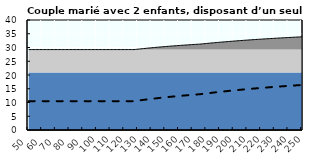
| Category | Coin fiscal moyen (somme des composantes) | Taux moyen d'imposition net en % du salaire brut |
|---|---|---|
| 50.0 | 29.249 | 10.5 |
| 51.0 | 29.249 | 10.5 |
| 52.0 | 29.249 | 10.5 |
| 53.0 | 29.249 | 10.5 |
| 54.0 | 29.249 | 10.5 |
| 55.0 | 29.249 | 10.5 |
| 56.0 | 29.249 | 10.5 |
| 57.0 | 29.249 | 10.5 |
| 58.0 | 29.249 | 10.5 |
| 59.0 | 29.249 | 10.5 |
| 60.0 | 29.249 | 10.5 |
| 61.0 | 29.249 | 10.5 |
| 62.0 | 29.249 | 10.5 |
| 63.0 | 29.249 | 10.5 |
| 64.0 | 29.249 | 10.5 |
| 65.0 | 29.249 | 10.5 |
| 66.0 | 29.249 | 10.5 |
| 67.0 | 29.249 | 10.5 |
| 68.0 | 29.249 | 10.5 |
| 69.0 | 29.249 | 10.5 |
| 70.0 | 29.249 | 10.5 |
| 71.0 | 29.249 | 10.5 |
| 72.0 | 29.249 | 10.5 |
| 73.0 | 29.249 | 10.5 |
| 74.0 | 29.249 | 10.5 |
| 75.0 | 29.249 | 10.5 |
| 76.0 | 29.249 | 10.5 |
| 77.0 | 29.249 | 10.5 |
| 78.0 | 29.249 | 10.5 |
| 79.0 | 29.249 | 10.5 |
| 80.0 | 29.249 | 10.5 |
| 81.0 | 29.249 | 10.5 |
| 82.0 | 29.249 | 10.5 |
| 83.0 | 29.249 | 10.5 |
| 84.0 | 29.249 | 10.5 |
| 85.0 | 29.249 | 10.5 |
| 86.0 | 29.249 | 10.5 |
| 87.0 | 29.249 | 10.5 |
| 88.0 | 29.249 | 10.5 |
| 89.0 | 29.249 | 10.5 |
| 90.0 | 29.249 | 10.5 |
| 91.0 | 29.249 | 10.5 |
| 92.0 | 29.249 | 10.5 |
| 93.0 | 29.249 | 10.5 |
| 94.0 | 29.249 | 10.5 |
| 95.0 | 29.249 | 10.5 |
| 96.0 | 29.249 | 10.5 |
| 97.0 | 29.249 | 10.5 |
| 98.0 | 29.249 | 10.5 |
| 99.0 | 29.249 | 10.5 |
| 100.0 | 29.249 | 10.5 |
| 101.0 | 29.249 | 10.5 |
| 102.0 | 29.249 | 10.5 |
| 103.0 | 29.249 | 10.5 |
| 104.0 | 29.249 | 10.5 |
| 105.0 | 29.249 | 10.5 |
| 106.0 | 29.249 | 10.5 |
| 107.0 | 29.249 | 10.5 |
| 108.0 | 29.249 | 10.5 |
| 109.0 | 29.249 | 10.5 |
| 110.0 | 29.249 | 10.5 |
| 111.0 | 29.249 | 10.5 |
| 112.0 | 29.249 | 10.5 |
| 113.0 | 29.249 | 10.5 |
| 114.0 | 29.249 | 10.5 |
| 115.0 | 29.249 | 10.5 |
| 116.0 | 29.249 | 10.5 |
| 117.0 | 29.249 | 10.5 |
| 118.0 | 29.249 | 10.5 |
| 119.0 | 29.249 | 10.5 |
| 120.0 | 29.249 | 10.5 |
| 121.0 | 29.249 | 10.5 |
| 122.0 | 29.249 | 10.5 |
| 123.0 | 29.249 | 10.5 |
| 124.0 | 29.249 | 10.5 |
| 125.0 | 29.249 | 10.5 |
| 126.0 | 29.249 | 10.5 |
| 127.0 | 29.249 | 10.5 |
| 128.0 | 29.29 | 10.551 |
| 129.0 | 29.346 | 10.622 |
| 130.0 | 29.401 | 10.692 |
| 131.0 | 29.455 | 10.76 |
| 132.0 | 29.508 | 10.828 |
| 133.0 | 29.561 | 10.894 |
| 134.0 | 29.613 | 10.96 |
| 135.0 | 29.664 | 11.025 |
| 136.0 | 29.714 | 11.088 |
| 137.0 | 29.764 | 11.151 |
| 138.0 | 29.812 | 11.213 |
| 139.0 | 29.861 | 11.274 |
| 140.0 | 29.908 | 11.334 |
| 141.0 | 29.955 | 11.393 |
| 142.0 | 30.001 | 11.451 |
| 143.0 | 30.046 | 11.509 |
| 144.0 | 30.091 | 11.565 |
| 145.0 | 30.135 | 11.621 |
| 146.0 | 30.179 | 11.677 |
| 147.0 | 30.222 | 11.731 |
| 148.0 | 30.265 | 11.785 |
| 149.0 | 30.306 | 11.838 |
| 150.0 | 30.348 | 11.89 |
| 151.0 | 30.389 | 11.942 |
| 152.0 | 30.429 | 11.992 |
| 153.0 | 30.469 | 12.043 |
| 154.0 | 30.508 | 12.092 |
| 155.0 | 30.546 | 12.141 |
| 156.0 | 30.585 | 12.19 |
| 157.0 | 30.622 | 12.237 |
| 158.0 | 30.66 | 12.284 |
| 159.0 | 30.696 | 12.331 |
| 160.0 | 30.733 | 12.377 |
| 161.0 | 30.768 | 12.422 |
| 162.0 | 30.804 | 12.467 |
| 163.0 | 30.839 | 12.511 |
| 164.0 | 30.873 | 12.555 |
| 165.0 | 30.907 | 12.598 |
| 166.0 | 30.941 | 12.641 |
| 167.0 | 30.975 | 12.683 |
| 168.0 | 31.007 | 12.724 |
| 169.0 | 31.04 | 12.766 |
| 170.0 | 31.072 | 12.806 |
| 171.0 | 31.104 | 12.846 |
| 172.0 | 31.135 | 12.886 |
| 173.0 | 31.166 | 12.925 |
| 174.0 | 31.197 | 12.964 |
| 175.0 | 31.227 | 13.003 |
| 176.0 | 31.27 | 13.056 |
| 177.0 | 31.32 | 13.12 |
| 178.0 | 31.37 | 13.182 |
| 179.0 | 31.418 | 13.244 |
| 180.0 | 31.467 | 13.306 |
| 181.0 | 31.515 | 13.366 |
| 182.0 | 31.562 | 13.426 |
| 183.0 | 31.609 | 13.485 |
| 184.0 | 31.655 | 13.544 |
| 185.0 | 31.701 | 13.602 |
| 186.0 | 31.746 | 13.659 |
| 187.0 | 31.791 | 13.716 |
| 188.0 | 31.836 | 13.772 |
| 189.0 | 31.88 | 13.828 |
| 190.0 | 31.923 | 13.883 |
| 191.0 | 31.966 | 13.937 |
| 192.0 | 32.008 | 13.991 |
| 193.0 | 32.051 | 14.044 |
| 194.0 | 32.092 | 14.097 |
| 195.0 | 32.133 | 14.149 |
| 196.0 | 32.174 | 14.2 |
| 197.0 | 32.215 | 14.252 |
| 198.0 | 32.255 | 14.302 |
| 199.0 | 32.294 | 14.352 |
| 200.0 | 32.333 | 14.402 |
| 201.0 | 32.372 | 14.451 |
| 202.0 | 32.411 | 14.499 |
| 203.0 | 32.449 | 14.548 |
| 204.0 | 32.486 | 14.595 |
| 205.0 | 32.524 | 14.642 |
| 206.0 | 32.561 | 14.689 |
| 207.0 | 32.597 | 14.735 |
| 208.0 | 32.633 | 14.781 |
| 209.0 | 32.669 | 14.827 |
| 210.0 | 32.705 | 14.872 |
| 211.0 | 32.74 | 14.916 |
| 212.0 | 32.775 | 14.96 |
| 213.0 | 32.809 | 15.004 |
| 214.0 | 32.844 | 15.047 |
| 215.0 | 32.877 | 15.09 |
| 216.0 | 32.911 | 15.133 |
| 217.0 | 32.944 | 15.175 |
| 218.0 | 32.977 | 15.216 |
| 219.0 | 33.01 | 15.258 |
| 220.0 | 33.042 | 15.299 |
| 221.0 | 33.074 | 15.339 |
| 222.0 | 33.106 | 15.379 |
| 223.0 | 33.138 | 15.419 |
| 224.0 | 33.169 | 15.459 |
| 225.0 | 33.2 | 15.498 |
| 226.0 | 33.231 | 15.537 |
| 227.0 | 33.261 | 15.575 |
| 228.0 | 33.291 | 15.613 |
| 229.0 | 33.321 | 15.651 |
| 230.0 | 33.351 | 15.689 |
| 231.0 | 33.38 | 15.726 |
| 232.0 | 33.409 | 15.762 |
| 233.0 | 33.438 | 15.799 |
| 234.0 | 33.467 | 15.835 |
| 235.0 | 33.495 | 15.871 |
| 236.0 | 33.523 | 15.907 |
| 237.0 | 33.551 | 15.942 |
| 238.0 | 33.579 | 15.977 |
| 239.0 | 33.606 | 16.012 |
| 240.0 | 33.633 | 16.046 |
| 241.0 | 33.66 | 16.08 |
| 242.0 | 33.687 | 16.114 |
| 243.0 | 33.713 | 16.147 |
| 244.0 | 33.74 | 16.181 |
| 245.0 | 33.766 | 16.214 |
| 246.0 | 33.792 | 16.246 |
| 247.0 | 33.817 | 16.279 |
| 248.0 | 33.843 | 16.311 |
| 249.0 | 33.868 | 16.343 |
| 250.0 | 33.893 | 16.375 |